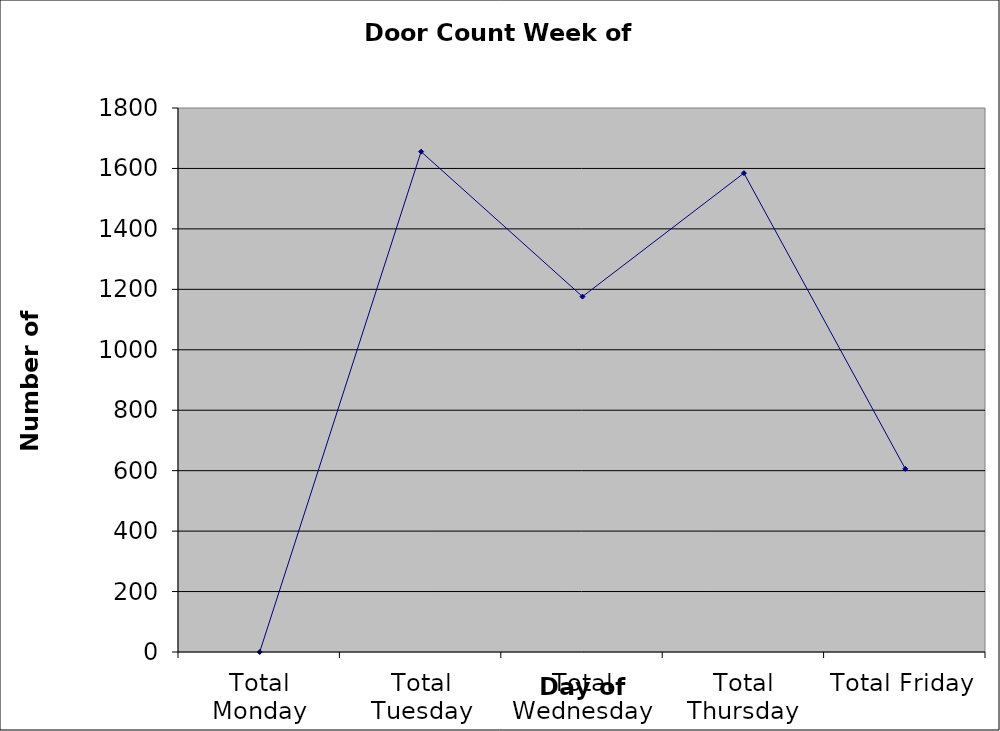
| Category | Series 0 |
|---|---|
| Total Monday | 0 |
| Total Tuesday | 1655.5 |
| Total Wednesday | 1176 |
| Total Thursday | 1584.5 |
| Total Friday | 606 |